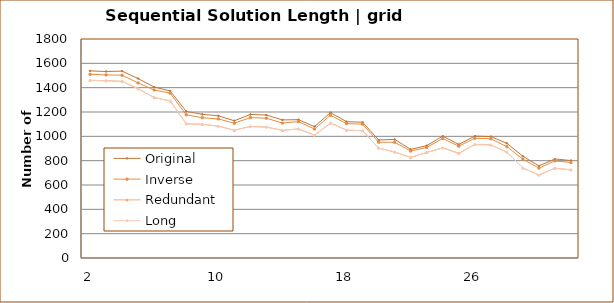
| Category | Original | Inverse | Redundant | Long |
|---|---|---|---|---|
| 2.0 | 1538 | 1510 | 1460 | 1460 |
| 3.0 | 1533 | 1505 | 1457 | 1457 |
| 4.0 | 1536 | 1502 | 1452 | 1452 |
| 5.0 | 1475 | 1439 | 1391 | 1391 |
| 6.0 | 1405 | 1381 | 1319 | 1319 |
| 7.0 | 1373 | 1355 | 1291 | 1291 |
| 8.0 | 1205 | 1177 | 1103 | 1103 |
| 9.0 | 1181 | 1153 | 1099 | 1099 |
| 10.0 | 1169 | 1143 | 1085 | 1083 |
| 11.0 | 1128 | 1108 | 1050 | 1050 |
| 12.0 | 1180 | 1154 | 1082 | 1080 |
| 13.0 | 1175 | 1149 | 1077 | 1075 |
| 14.0 | 1135 | 1109 | 1049 | 1049 |
| 15.0 | 1137 | 1121 | 1061 | 1061 |
| 16.0 | 1080 | 1060 | 1010 | 1008 |
| 17.0 | 1195 | 1173 | 1109 | 1109 |
| 18.0 | 1121 | 1105 | 1051 | 1051 |
| 19.0 | 1116 | 1100 | 1046 | 1046 |
| 20.0 | 970 | 952 | 904 | 904 |
| 21.0 | 975 | 951 | 871 | 871 |
| 22.0 | 893 | 879 | 827 | 827 |
| 23.0 | 923 | 909 | 867 | 867 |
| 24.0 | 1002 | 982 | 906 | 904 |
| 25.0 | 933 | 919 | 861 | 857 |
| 26.0 | 1002 | 984 | 934 | 932 |
| 27.0 | 998 | 980 | 930 | 928 |
| 28.0 | 943 | 915 | 871 | 871 |
| 29.0 | 836 | 812 | 740 | 740 |
| 30.0 | 757 | 739 | 683 | 681 |
| 31.0 | 814 | 798 | 738 | 738 |
| 32.0 | 801 | 785 | 725 | 723 |